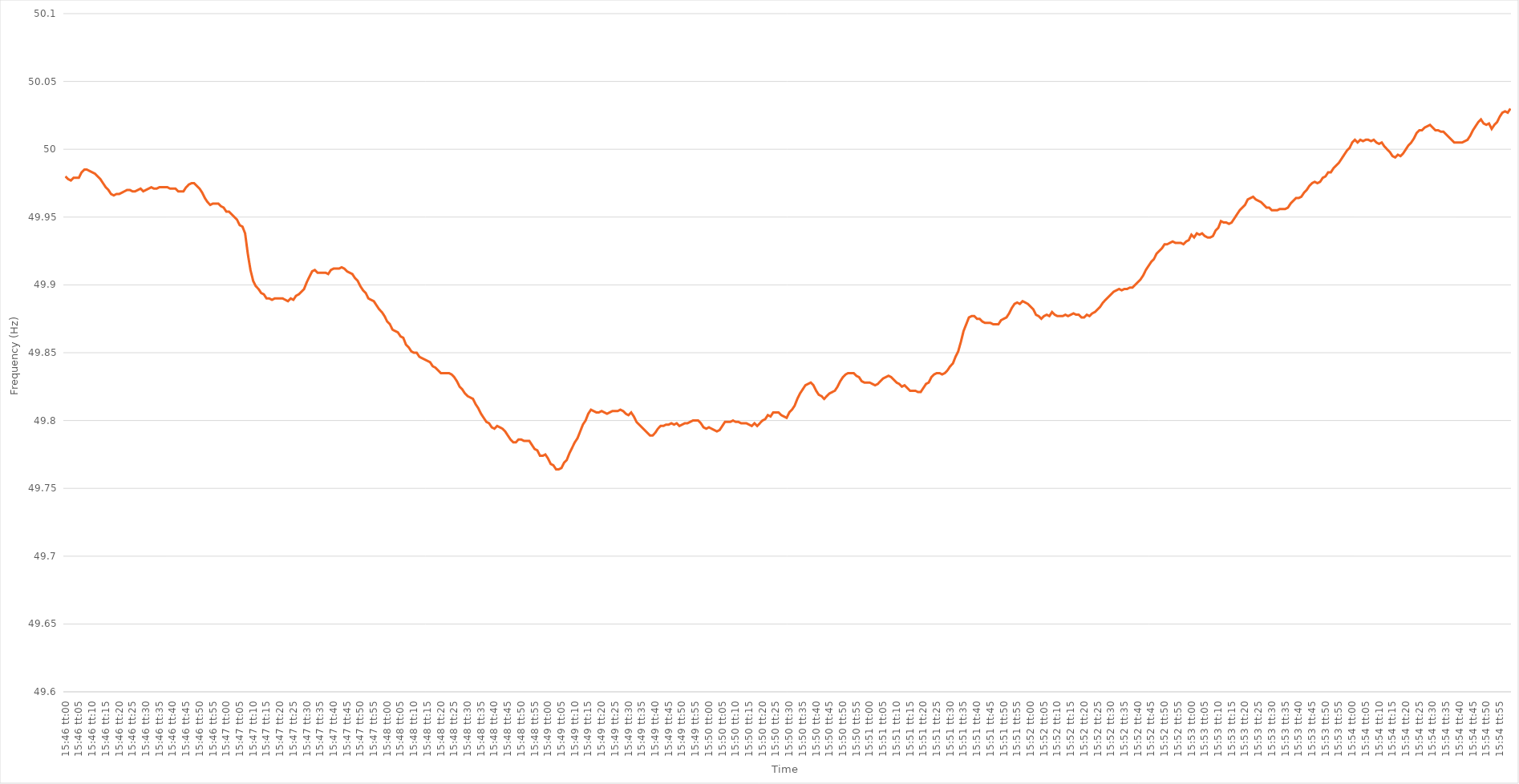
| Category | Series 0 |
|---|---|
| 0.6569444444444444 | 49.98 |
| 0.6569560185185185 | 49.978 |
| 0.6569675925925925 | 49.977 |
| 0.6569791666666667 | 49.979 |
| 0.6569907407407407 | 49.979 |
| 0.6570023148148149 | 49.979 |
| 0.6570138888888889 | 49.983 |
| 0.6570254629629629 | 49.985 |
| 0.657037037037037 | 49.985 |
| 0.6570486111111111 | 49.984 |
| 0.6570601851851852 | 49.983 |
| 0.6570717592592593 | 49.982 |
| 0.6570833333333334 | 49.98 |
| 0.6570949074074074 | 49.978 |
| 0.6571064814814814 | 49.975 |
| 0.6571180555555556 | 49.972 |
| 0.6571296296296296 | 49.97 |
| 0.6571412037037038 | 49.967 |
| 0.6571527777777778 | 49.966 |
| 0.6571643518518518 | 49.967 |
| 0.6571759259259259 | 49.967 |
| 0.6571875 | 49.968 |
| 0.6571990740740741 | 49.969 |
| 0.6572106481481481 | 49.97 |
| 0.6572222222222223 | 49.97 |
| 0.6572337962962963 | 49.969 |
| 0.6572453703703703 | 49.969 |
| 0.6572569444444444 | 49.97 |
| 0.6572685185185185 | 49.971 |
| 0.6572800925925926 | 49.969 |
| 0.6572916666666667 | 49.97 |
| 0.6573032407407408 | 49.971 |
| 0.6573148148148148 | 49.972 |
| 0.6573263888888888 | 49.971 |
| 0.657337962962963 | 49.971 |
| 0.657349537037037 | 49.972 |
| 0.6573611111111112 | 49.972 |
| 0.6573726851851852 | 49.972 |
| 0.6573842592592593 | 49.972 |
| 0.6573958333333333 | 49.971 |
| 0.6574074074074074 | 49.971 |
| 0.6574189814814815 | 49.971 |
| 0.6574305555555556 | 49.969 |
| 0.6574421296296297 | 49.969 |
| 0.6574537037037037 | 49.969 |
| 0.6574652777777777 | 49.972 |
| 0.6574768518518518 | 49.974 |
| 0.6574884259259259 | 49.975 |
| 0.6575 | 49.975 |
| 0.6575115740740741 | 49.973 |
| 0.6575231481481482 | 49.971 |
| 0.6575347222222222 | 49.968 |
| 0.6575462962962962 | 49.964 |
| 0.6575578703703704 | 49.961 |
| 0.6575694444444444 | 49.959 |
| 0.6575810185185186 | 49.96 |
| 0.6575925925925926 | 49.96 |
| 0.6576041666666667 | 49.96 |
| 0.6576157407407407 | 49.958 |
| 0.6576273148148148 | 49.957 |
| 0.6576388888888889 | 49.954 |
| 0.657650462962963 | 49.954 |
| 0.6576620370370371 | 49.952 |
| 0.6576736111111111 | 49.95 |
| 0.6576851851851852 | 49.948 |
| 0.6576967592592592 | 49.944 |
| 0.6577083333333333 | 49.943 |
| 0.6577199074074074 | 49.938 |
| 0.6577314814814815 | 49.923 |
| 0.6577430555555556 | 49.911 |
| 0.6577546296296296 | 49.903 |
| 0.6577662037037036 | 49.899 |
| 0.6577777777777778 | 49.897 |
| 0.6577893518518518 | 49.894 |
| 0.657800925925926 | 49.893 |
| 0.6578125 | 49.89 |
| 0.6578240740740741 | 49.89 |
| 0.6578356481481481 | 49.889 |
| 0.6578472222222222 | 49.89 |
| 0.6578587962962963 | 49.89 |
| 0.6578703703703704 | 49.89 |
| 0.6578819444444445 | 49.89 |
| 0.6578935185185185 | 49.889 |
| 0.6579050925925926 | 49.888 |
| 0.6579166666666666 | 49.89 |
| 0.6579282407407407 | 49.889 |
| 0.6579398148148148 | 49.892 |
| 0.6579513888888889 | 49.893 |
| 0.657962962962963 | 49.895 |
| 0.657974537037037 | 49.897 |
| 0.657986111111111 | 49.902 |
| 0.6579976851851852 | 49.906 |
| 0.6580092592592592 | 49.91 |
| 0.6580208333333334 | 49.911 |
| 0.6580324074074074 | 49.909 |
| 0.6580439814814815 | 49.909 |
| 0.6580555555555555 | 49.909 |
| 0.6580671296296297 | 49.909 |
| 0.6580787037037037 | 49.908 |
| 0.6580902777777778 | 49.911 |
| 0.6581018518518519 | 49.912 |
| 0.6581134259259259 | 49.912 |
| 0.658125 | 49.912 |
| 0.6581365740740741 | 49.913 |
| 0.6581481481481481 | 49.912 |
| 0.6581597222222222 | 49.91 |
| 0.6581712962962963 | 49.909 |
| 0.6581828703703704 | 49.908 |
| 0.6581944444444444 | 49.905 |
| 0.6582060185185185 | 49.903 |
| 0.6582175925925926 | 49.899 |
| 0.6582291666666666 | 49.896 |
| 0.6582407407407408 | 49.894 |
| 0.6582523148148148 | 49.89 |
| 0.6582638888888889 | 49.889 |
| 0.6582754629629629 | 49.888 |
| 0.6582870370370371 | 49.885 |
| 0.6582986111111111 | 49.882 |
| 0.6583101851851852 | 49.88 |
| 0.6583217592592593 | 49.877 |
| 0.6583333333333333 | 49.873 |
| 0.6583449074074074 | 49.871 |
| 0.6583564814814815 | 49.867 |
| 0.6583680555555556 | 49.866 |
| 0.6583796296296297 | 49.865 |
| 0.6583912037037037 | 49.862 |
| 0.6584027777777778 | 49.861 |
| 0.6584143518518518 | 49.856 |
| 0.6584259259259259 | 49.854 |
| 0.6584375 | 49.851 |
| 0.658449074074074 | 49.85 |
| 0.6584606481481482 | 49.85 |
| 0.6584722222222222 | 49.847 |
| 0.6584837962962963 | 49.846 |
| 0.6584953703703703 | 49.845 |
| 0.6585069444444445 | 49.844 |
| 0.6585185185185185 | 49.843 |
| 0.6585300925925927 | 49.84 |
| 0.6585416666666667 | 49.839 |
| 0.6585532407407407 | 49.837 |
| 0.6585648148148148 | 49.835 |
| 0.6585763888888889 | 49.835 |
| 0.658587962962963 | 49.835 |
| 0.6585995370370371 | 49.835 |
| 0.6586111111111111 | 49.834 |
| 0.6586226851851852 | 49.832 |
| 0.6586342592592592 | 49.829 |
| 0.6586458333333333 | 49.825 |
| 0.6586574074074074 | 49.823 |
| 0.6586689814814815 | 49.82 |
| 0.6586805555555556 | 49.818 |
| 0.6586921296296296 | 49.817 |
| 0.6587037037037037 | 49.816 |
| 0.6587152777777777 | 49.812 |
| 0.6587268518518519 | 49.809 |
| 0.6587384259259259 | 49.805 |
| 0.6587500000000001 | 49.802 |
| 0.6587615740740741 | 49.799 |
| 0.6587731481481481 | 49.798 |
| 0.6587847222222222 | 49.795 |
| 0.6587962962962963 | 49.794 |
| 0.6588078703703704 | 49.796 |
| 0.6588194444444445 | 49.795 |
| 0.6588310185185186 | 49.794 |
| 0.6588425925925926 | 49.792 |
| 0.6588541666666666 | 49.789 |
| 0.6588657407407407 | 49.786 |
| 0.6588773148148148 | 49.784 |
| 0.6588888888888889 | 49.784 |
| 0.658900462962963 | 49.786 |
| 0.658912037037037 | 49.786 |
| 0.6589236111111111 | 49.785 |
| 0.6589351851851851 | 49.785 |
| 0.6589467592592593 | 49.785 |
| 0.6589583333333333 | 49.782 |
| 0.6589699074074075 | 49.779 |
| 0.6589814814814815 | 49.778 |
| 0.6589930555555555 | 49.774 |
| 0.6590046296296296 | 49.774 |
| 0.6590162037037037 | 49.775 |
| 0.6590277777777778 | 49.772 |
| 0.6590393518518519 | 49.768 |
| 0.659050925925926 | 49.767 |
| 0.6590625 | 49.764 |
| 0.659074074074074 | 49.764 |
| 0.6590856481481482 | 49.765 |
| 0.6590972222222222 | 49.769 |
| 0.6591087962962963 | 49.771 |
| 0.6591203703703704 | 49.776 |
| 0.6591319444444445 | 49.78 |
| 0.6591435185185185 | 49.784 |
| 0.6591550925925925 | 49.787 |
| 0.6591666666666667 | 49.792 |
| 0.6591782407407407 | 49.797 |
| 0.6591898148148149 | 49.8 |
| 0.6592013888888889 | 49.805 |
| 0.659212962962963 | 49.808 |
| 0.659224537037037 | 49.807 |
| 0.6592361111111111 | 49.806 |
| 0.6592476851851852 | 49.806 |
| 0.6592592592592593 | 49.807 |
| 0.6592708333333334 | 49.806 |
| 0.6592824074074074 | 49.805 |
| 0.6592939814814814 | 49.806 |
| 0.6593055555555556 | 49.807 |
| 0.6593171296296296 | 49.807 |
| 0.6593287037037037 | 49.807 |
| 0.6593402777777778 | 49.808 |
| 0.6593518518518519 | 49.807 |
| 0.6593634259259259 | 49.805 |
| 0.6593749999999999 | 49.804 |
| 0.6593865740740741 | 49.806 |
| 0.6593981481481481 | 49.803 |
| 0.6594097222222223 | 49.799 |
| 0.6594212962962963 | 49.797 |
| 0.6594328703703703 | 49.795 |
| 0.6594444444444444 | 49.793 |
| 0.6594560185185185 | 49.791 |
| 0.6594675925925926 | 49.789 |
| 0.6594791666666667 | 49.789 |
| 0.6594907407407408 | 49.791 |
| 0.6595023148148148 | 49.794 |
| 0.6595138888888888 | 49.796 |
| 0.659525462962963 | 49.796 |
| 0.659537037037037 | 49.797 |
| 0.6595486111111112 | 49.797 |
| 0.6595601851851852 | 49.798 |
| 0.6595717592592593 | 49.797 |
| 0.6595833333333333 | 49.798 |
| 0.6595949074074073 | 49.796 |
| 0.6596064814814815 | 49.797 |
| 0.6596180555555555 | 49.798 |
| 0.6596296296296297 | 49.798 |
| 0.6596412037037037 | 49.799 |
| 0.6596527777777778 | 49.8 |
| 0.6596643518518518 | 49.8 |
| 0.6596759259259259 | 49.8 |
| 0.6596875 | 49.798 |
| 0.6596990740740741 | 49.795 |
| 0.6597106481481482 | 49.794 |
| 0.6597222222222222 | 49.795 |
| 0.6597337962962962 | 49.794 |
| 0.6597453703703704 | 49.793 |
| 0.6597569444444444 | 49.792 |
| 0.6597685185185186 | 49.793 |
| 0.6597800925925926 | 49.796 |
| 0.6597916666666667 | 49.799 |
| 0.6598032407407407 | 49.799 |
| 0.6598148148148147 | 49.799 |
| 0.6598263888888889 | 49.8 |
| 0.6598379629629629 | 49.799 |
| 0.6598495370370371 | 49.799 |
| 0.6598611111111111 | 49.798 |
| 0.6598726851851852 | 49.798 |
| 0.6598842592592592 | 49.798 |
| 0.6598958333333333 | 49.797 |
| 0.6599074074074074 | 49.796 |
| 0.6599189814814815 | 49.798 |
| 0.6599305555555556 | 49.796 |
| 0.6599421296296296 | 49.798 |
| 0.6599537037037037 | 49.8 |
| 0.6599652777777778 | 49.801 |
| 0.6599768518518518 | 49.804 |
| 0.659988425925926 | 49.803 |
| 0.66 | 49.806 |
| 0.6600115740740741 | 49.806 |
| 0.6600231481481481 | 49.806 |
| 0.6600347222222223 | 49.804 |
| 0.6600462962962963 | 49.803 |
| 0.6600578703703703 | 49.802 |
| 0.6600694444444445 | 49.806 |
| 0.6600810185185185 | 49.808 |
| 0.6600925925925926 | 49.811 |
| 0.6601041666666666 | 49.816 |
| 0.6601157407407408 | 49.82 |
| 0.6601273148148148 | 49.823 |
| 0.6601388888888889 | 49.826 |
| 0.660150462962963 | 49.827 |
| 0.660162037037037 | 49.828 |
| 0.6601736111111111 | 49.826 |
| 0.6601851851851852 | 49.822 |
| 0.6601967592592592 | 49.819 |
| 0.6602083333333334 | 49.818 |
| 0.6602199074074074 | 49.816 |
| 0.6602314814814815 | 49.818 |
| 0.6602430555555555 | 49.82 |
| 0.6602546296296297 | 49.821 |
| 0.6602662037037037 | 49.822 |
| 0.6602777777777777 | 49.825 |
| 0.6602893518518519 | 49.829 |
| 0.6603009259259259 | 49.832 |
| 0.6603125 | 49.834 |
| 0.660324074074074 | 49.835 |
| 0.6603356481481482 | 49.835 |
| 0.6603472222222222 | 49.835 |
| 0.6603587962962963 | 49.833 |
| 0.6603703703703704 | 49.832 |
| 0.6603819444444444 | 49.829 |
| 0.6603935185185185 | 49.828 |
| 0.6604050925925926 | 49.828 |
| 0.6604166666666667 | 49.828 |
| 0.6604282407407408 | 49.827 |
| 0.6604398148148148 | 49.826 |
| 0.6604513888888889 | 49.827 |
| 0.6604629629629629 | 49.829 |
| 0.6604745370370371 | 49.831 |
| 0.6604861111111111 | 49.832 |
| 0.6604976851851853 | 49.833 |
| 0.6605092592592593 | 49.832 |
| 0.6605208333333333 | 49.83 |
| 0.6605324074074074 | 49.828 |
| 0.6605439814814814 | 49.827 |
| 0.6605555555555556 | 49.825 |
| 0.6605671296296296 | 49.826 |
| 0.6605787037037038 | 49.824 |
| 0.6605902777777778 | 49.822 |
| 0.6606018518518518 | 49.822 |
| 0.6606134259259259 | 49.822 |
| 0.660625 | 49.821 |
| 0.6606365740740741 | 49.821 |
| 0.6606481481481482 | 49.824 |
| 0.6606597222222222 | 49.827 |
| 0.6606712962962963 | 49.828 |
| 0.6606828703703703 | 49.832 |
| 0.6606944444444445 | 49.834 |
| 0.6607060185185185 | 49.835 |
| 0.6607175925925927 | 49.835 |
| 0.6607291666666667 | 49.834 |
| 0.6607407407407407 | 49.835 |
| 0.6607523148148148 | 49.837 |
| 0.6607638888888888 | 49.84 |
| 0.660775462962963 | 49.842 |
| 0.660787037037037 | 49.847 |
| 0.6607986111111112 | 49.851 |
| 0.6608101851851852 | 49.858 |
| 0.6608217592592592 | 49.866 |
| 0.6608333333333333 | 49.871 |
| 0.6608449074074074 | 49.876 |
| 0.6608564814814815 | 49.877 |
| 0.6608680555555556 | 49.877 |
| 0.6608796296296297 | 49.875 |
| 0.6608912037037037 | 49.875 |
| 0.6609027777777777 | 49.873 |
| 0.6609143518518519 | 49.872 |
| 0.6609259259259259 | 49.872 |
| 0.6609375000000001 | 49.872 |
| 0.6609490740740741 | 49.871 |
| 0.6609606481481481 | 49.871 |
| 0.6609722222222222 | 49.871 |
| 0.6609837962962963 | 49.874 |
| 0.6609953703703704 | 49.875 |
| 0.6610069444444444 | 49.876 |
| 0.6610185185185186 | 49.879 |
| 0.6610300925925926 | 49.883 |
| 0.6610416666666666 | 49.886 |
| 0.6610532407407407 | 49.887 |
| 0.6610648148148148 | 49.886 |
| 0.6610763888888889 | 49.888 |
| 0.661087962962963 | 49.887 |
| 0.661099537037037 | 49.886 |
| 0.6611111111111111 | 49.884 |
| 0.6611226851851851 | 49.882 |
| 0.6611342592592593 | 49.878 |
| 0.6611458333333333 | 49.877 |
| 0.6611574074074075 | 49.875 |
| 0.6611689814814815 | 49.877 |
| 0.6611805555555555 | 49.878 |
| 0.6611921296296296 | 49.877 |
| 0.6612037037037037 | 49.88 |
| 0.6612152777777778 | 49.878 |
| 0.6612268518518518 | 49.877 |
| 0.661238425925926 | 49.877 |
| 0.66125 | 49.877 |
| 0.661261574074074 | 49.878 |
| 0.6612731481481481 | 49.877 |
| 0.6612847222222222 | 49.878 |
| 0.6612962962962963 | 49.879 |
| 0.6613078703703704 | 49.878 |
| 0.6613194444444445 | 49.878 |
| 0.6613310185185185 | 49.876 |
| 0.6613425925925925 | 49.876 |
| 0.6613541666666667 | 49.878 |
| 0.6613657407407407 | 49.877 |
| 0.6613773148148149 | 49.879 |
| 0.6613888888888889 | 49.88 |
| 0.661400462962963 | 49.882 |
| 0.661412037037037 | 49.884 |
| 0.6614236111111111 | 49.887 |
| 0.6614351851851852 | 49.889 |
| 0.6614467592592593 | 49.891 |
| 0.6614583333333334 | 49.893 |
| 0.6614699074074074 | 49.895 |
| 0.6614814814814814 | 49.896 |
| 0.6614930555555555 | 49.897 |
| 0.6615046296296296 | 49.896 |
| 0.6615162037037037 | 49.897 |
| 0.6615277777777778 | 49.897 |
| 0.6615393518518519 | 49.898 |
| 0.6615509259259259 | 49.898 |
| 0.6615624999999999 | 49.9 |
| 0.6615740740740741 | 49.902 |
| 0.6615856481481481 | 49.904 |
| 0.6615972222222223 | 49.907 |
| 0.6616087962962963 | 49.911 |
| 0.6616203703703704 | 49.914 |
| 0.6616319444444444 | 49.917 |
| 0.6616435185185185 | 49.919 |
| 0.6616550925925926 | 49.923 |
| 0.6616666666666667 | 49.925 |
| 0.6616782407407408 | 49.927 |
| 0.6616898148148148 | 49.93 |
| 0.6617013888888889 | 49.93 |
| 0.6617129629629629 | 49.931 |
| 0.661724537037037 | 49.932 |
| 0.6617361111111111 | 49.931 |
| 0.6617476851851852 | 49.931 |
| 0.6617592592592593 | 49.931 |
| 0.6617708333333333 | 49.93 |
| 0.6617824074074073 | 49.932 |
| 0.6617939814814815 | 49.933 |
| 0.6618055555555555 | 49.937 |
| 0.6618171296296297 | 49.935 |
| 0.6618287037037037 | 49.938 |
| 0.6618402777777778 | 49.937 |
| 0.6618518518518518 | 49.938 |
| 0.661863425925926 | 49.936 |
| 0.661875 | 49.935 |
| 0.6618865740740741 | 49.935 |
| 0.6618981481481482 | 49.936 |
| 0.6619097222222222 | 49.94 |
| 0.6619212962962963 | 49.942 |
| 0.6619328703703703 | 49.947 |
| 0.6619444444444444 | 49.946 |
| 0.6619560185185185 | 49.946 |
| 0.6619675925925926 | 49.945 |
| 0.6619791666666667 | 49.946 |
| 0.6619907407407407 | 49.949 |
| 0.6620023148148148 | 49.952 |
| 0.6620138888888889 | 49.955 |
| 0.6620254629629629 | 49.957 |
| 0.6620370370370371 | 49.959 |
| 0.6620486111111111 | 49.963 |
| 0.6620601851851852 | 49.964 |
| 0.6620717592592592 | 49.965 |
| 0.6620833333333334 | 49.963 |
| 0.6620949074074074 | 49.962 |
| 0.6621064814814815 | 49.961 |
| 0.6621180555555556 | 49.959 |
| 0.6621296296296296 | 49.957 |
| 0.6621412037037037 | 49.957 |
| 0.6621527777777778 | 49.955 |
| 0.6621643518518519 | 49.955 |
| 0.6621759259259259 | 49.955 |
| 0.6621875 | 49.956 |
| 0.6621990740740741 | 49.956 |
| 0.6622106481481481 | 49.956 |
| 0.6622222222222222 | 49.957 |
| 0.6622337962962963 | 49.96 |
| 0.6622453703703703 | 49.962 |
| 0.6622569444444445 | 49.964 |
| 0.6622685185185185 | 49.964 |
| 0.6622800925925926 | 49.965 |
| 0.6622916666666666 | 49.968 |
| 0.6623032407407408 | 49.97 |
| 0.6623148148148148 | 49.973 |
| 0.662326388888889 | 49.975 |
| 0.662337962962963 | 49.976 |
| 0.662349537037037 | 49.975 |
| 0.6623611111111111 | 49.976 |
| 0.6623726851851852 | 49.979 |
| 0.6623842592592593 | 49.98 |
| 0.6623958333333334 | 49.983 |
| 0.6624074074074074 | 49.983 |
| 0.6624189814814815 | 49.986 |
| 0.6624305555555555 | 49.988 |
| 0.6624421296296296 | 49.99 |
| 0.6624537037037037 | 49.993 |
| 0.6624652777777778 | 49.996 |
| 0.6624768518518519 | 49.999 |
| 0.6624884259259259 | 50.001 |
| 0.6625 | 50.005 |
| 0.662511574074074 | 50.007 |
| 0.6625231481481482 | 50.005 |
| 0.6625347222222222 | 50.007 |
| 0.6625462962962964 | 50.006 |
| 0.6625578703703704 | 50.007 |
| 0.6625694444444444 | 50.007 |
| 0.6625810185185185 | 50.006 |
| 0.6625925925925926 | 50.007 |
| 0.6626041666666667 | 50.005 |
| 0.6626157407407408 | 50.004 |
| 0.6626273148148148 | 50.005 |
| 0.6626388888888889 | 50.002 |
| 0.6626504629629629 | 50 |
| 0.662662037037037 | 49.998 |
| 0.6626736111111111 | 49.995 |
| 0.6626851851851852 | 49.994 |
| 0.6626967592592593 | 49.996 |
| 0.6627083333333333 | 49.995 |
| 0.6627199074074074 | 49.997 |
| 0.6627314814814814 | 50 |
| 0.6627430555555556 | 50.003 |
| 0.6627546296296296 | 50.005 |
| 0.6627662037037038 | 50.008 |
| 0.6627777777777778 | 50.012 |
| 0.6627893518518518 | 50.014 |
| 0.6628009259259259 | 50.014 |
| 0.6628125 | 50.016 |
| 0.6628240740740741 | 50.017 |
| 0.6628356481481482 | 50.018 |
| 0.6628472222222223 | 50.016 |
| 0.6628587962962963 | 50.014 |
| 0.6628703703703703 | 50.014 |
| 0.6628819444444444 | 50.013 |
| 0.6628935185185185 | 50.013 |
| 0.6629050925925926 | 50.011 |
| 0.6629166666666667 | 50.009 |
| 0.6629282407407407 | 50.007 |
| 0.6629398148148148 | 50.005 |
| 0.6629513888888888 | 50.005 |
| 0.662962962962963 | 50.005 |
| 0.662974537037037 | 50.005 |
| 0.6629861111111112 | 50.006 |
| 0.6629976851851852 | 50.007 |
| 0.6630092592592592 | 50.01 |
| 0.6630208333333333 | 50.014 |
| 0.6630324074074074 | 50.017 |
| 0.6630439814814815 | 50.02 |
| 0.6630555555555556 | 50.022 |
| 0.6630671296296297 | 50.019 |
| 0.6630787037037037 | 50.018 |
| 0.6630902777777777 | 50.019 |
| 0.6631018518518519 | 50.015 |
| 0.6631134259259259 | 50.018 |
| 0.663125 | 50.02 |
| 0.6631365740740741 | 50.024 |
| 0.6631481481481482 | 50.027 |
| 0.6631597222222222 | 50.028 |
| 0.6631712962962962 | 50.027 |
| 0.6631828703703704 | 50.03 |